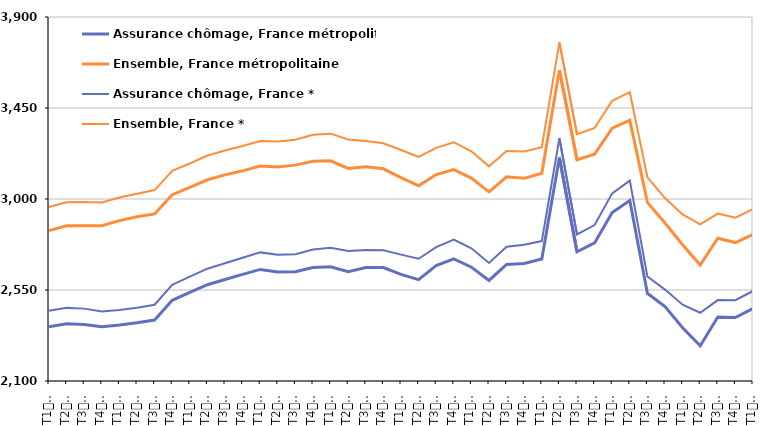
| Category | Assurance chômage, France métropolitaine | Ensemble, France métropolitaine | Assurance chômage, France * | Ensemble, France * |
|---|---|---|---|---|
| T1
2013 | 2367.8 | 2843.7 | 2447.3 | 2960.5 |
| T2
2013 | 2382.7 | 2867.2 | 2461.6 | 2984.3 |
| T3
2013 | 2379.9 | 2868.3 | 2457.9 | 2985 |
| T4
2013 | 2368 | 2867.5 | 2444 | 2982.8 |
| T1
2014 | 2376.7 | 2893.2 | 2451.1 | 3007.5 |
| T2
2014 | 2387.9 | 2912 | 2462 | 3025.7 |
| T3
2014 | 2401.2 | 2926.3 | 2477 | 3044.2 |
| T4
2014 | 2499.2 | 3021.1 | 2575.9 | 3139.2 |
| T1
2015 | 2538 | 3056.9 | 2616.1 | 3175.6 |
| T2
2015 | 2576.2 | 3095.1 | 2655.4 | 3214.8 |
| T3
2015 | 2601.7 | 3119.2 | 2682 | 3239.6 |
| T4
2015 | 2627 | 3139.3 | 2709.3 | 3261.7 |
| T1
2016 | 2651.8 | 3163.2 | 2736 | 3287.2 |
| T2
2016 | 2639.3 | 3158.5 | 2724.5 | 3284.7 |
| T3
2016 | 2640.2 | 3167.5 | 2726.6 | 3292.6 |
| T4
2016 | 2661.4 | 3187.1 | 2750.6 | 3317.2 |
| T1
2017 | 2665 | 3188.8 | 2759.2 | 3323.2 |
| T2
2017 | 2640.5 | 3151.4 | 2743.1 | 3294.5 |
| T3
2017 | 2660.9 | 3159.5 | 2747.4 | 3287.1 |
| T4
2017 | 2661.2 | 3149.3 | 2746.8 | 3275.3 |
| T1
2018 | 2627.3 | 3105.4 | 2724.8 | 3242.6 |
| T2
2018 | 2601.4 | 3065.8 | 2704.4 | 3208 |
| T3
2018 | 2670.9 | 3121.1 | 2762.3 | 3252.6 |
| T4
2018 | 2703.6 | 3145.7 | 2799.2 | 3280.7 |
| T1
2019 | 2662.9 | 3103.7 | 2756.2 | 3235.7 |
| T2
2019 | 2597.1 | 3035.5 | 2683.9 | 3161.5 |
| T3
2019 | 2676.7 | 3109.4 | 2764.1 | 3236.8 |
| T4
2019 | 2680.9 | 3102.2 | 2773.9 | 3234.5 |
| T1
2020 | 2703.6 | 3127.5 | 2792 | 3255.8 |
| T2
2020 | 3204.8 | 3637.8 | 3300.5 | 3774.3 |
| T3
2020 | 2738.7 | 3193.9 | 2824.7 | 3320.8 |
| T4
2020 | 2782.9 | 3221.9 | 2871.3 | 3351.2 |
| T1
2021 | 2933.4 | 3350.1 | 3028.1 | 3485.7 |
| T2
2021 | 2992.4 | 3389.5 | 3091.1 | 3528.2 |
| T3
2021 | 2533.6 | 2983.4 | 2616.7 | 3107.3 |
| T4
2021 | 2468.1 | 2881.5 | 2552.1 | 3004.6 |
| T1
2022 | 2363.1 | 2773.9 | 2477.2 | 2923.9 |
| T2
2022 | 2273.5 | 2673.4 | 2437.6 | 2874.8 |
| T3
2022 | 2416.3 | 2805.7 | 2500.2 | 2928.1 |
| T4
2022 | 2413.7 | 2784.5 | 2499.4 | 2908 |
| T1
2023 | 2458.3 | 2824.9 | 2545.2 | 2950.2 |